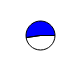
| Category | Series 0 |
|---|---|
| 0 | 5706287 |
| 1 | 6270137 |